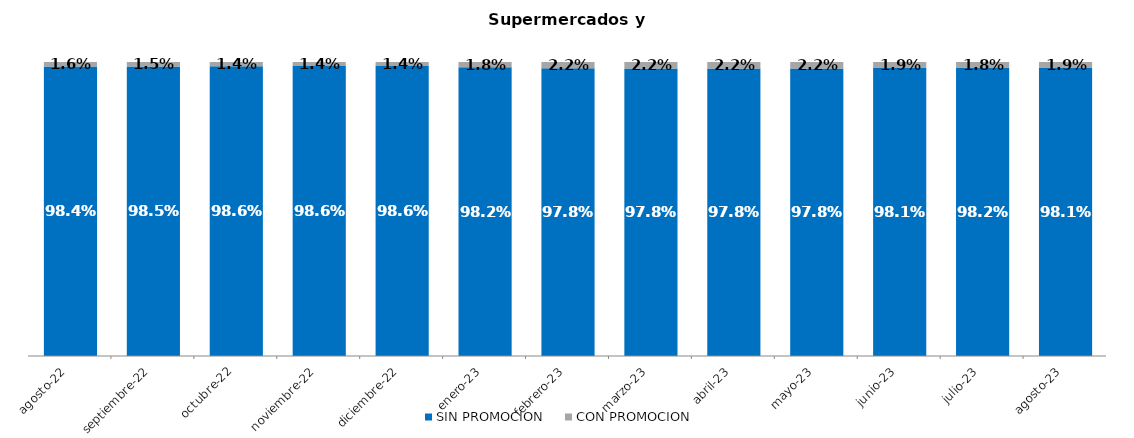
| Category | SIN PROMOCION   | CON PROMOCION   |
|---|---|---|
| 2022-08-01 | 0.984 | 0.016 |
| 2022-09-01 | 0.985 | 0.015 |
| 2022-10-01 | 0.986 | 0.014 |
| 2022-11-01 | 0.986 | 0.014 |
| 2022-12-01 | 0.986 | 0.014 |
| 2023-01-01 | 0.982 | 0.018 |
| 2023-02-01 | 0.978 | 0.022 |
| 2023-03-01 | 0.978 | 0.022 |
| 2023-04-01 | 0.978 | 0.022 |
| 2023-05-01 | 0.978 | 0.022 |
| 2023-06-01 | 0.981 | 0.019 |
| 2023-07-01 | 0.982 | 0.018 |
| 2023-08-01 | 0.981 | 0.019 |